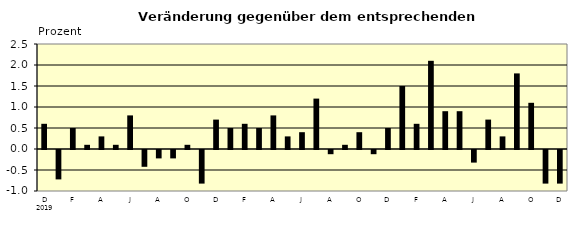
| Category | Series 0 |
|---|---|
| 0 | 0.6 |
| 1 | -0.7 |
| 2 | 0.5 |
| 3 | 0.1 |
| 4 | 0.3 |
| 5 | 0.1 |
| 6 | 0.8 |
| 7 | -0.4 |
| 8 | -0.2 |
| 9 | -0.2 |
| 10 | 0.1 |
| 11 | -0.8 |
| 12 | 0.7 |
| 13 | 0.5 |
| 14 | 0.6 |
| 15 | 0.5 |
| 16 | 0.8 |
| 17 | 0.3 |
| 18 | 0.4 |
| 19 | 1.2 |
| 20 | -0.1 |
| 21 | 0.1 |
| 22 | 0.4 |
| 23 | -0.1 |
| 24 | 0.5 |
| 25 | 1.5 |
| 26 | 0.6 |
| 27 | 2.1 |
| 28 | 0.9 |
| 29 | 0.9 |
| 30 | -0.3 |
| 31 | 0.7 |
| 32 | 0.3 |
| 33 | 1.8 |
| 34 | 1.1 |
| 35 | -0.8 |
| 36 | -0.8 |